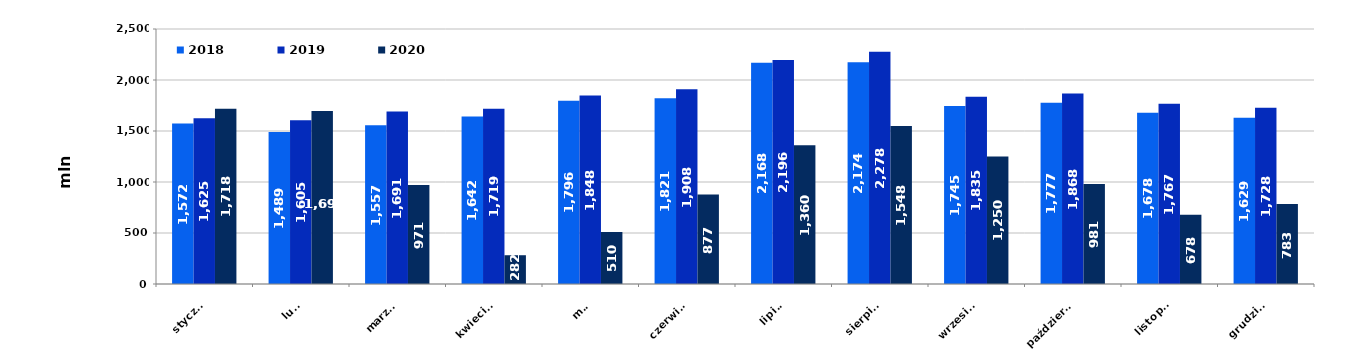
| Category | 2018 | 2019 | 2020 |
|---|---|---|---|
| 0 | 1572.381 | 1624.526 | 1718.2 |
| 1 | 1489.091 | 1604.654 | 1695.499 |
| 2 | 1556.68 | 1690.501 | 970.887 |
| 3 | 1641.598 | 1718.759 | 282.128 |
| 4 | 1795.786 | 1847.809 | 510.258 |
| 5 | 1820.536 | 1908.355 | 876.769 |
| 6 | 2167.927 | 2195.523 | 1360.027 |
| 7 | 2173.885 | 2277.629 | 1548.011 |
| 8 | 1745.058 | 1834.999 | 1249.993 |
| 9 | 1777.151 | 1867.597 | 981.263 |
| 10 | 1678.054 | 1766.683 | 677.888 |
| 11 | 1629.181 | 1728.165 | 783.386 |